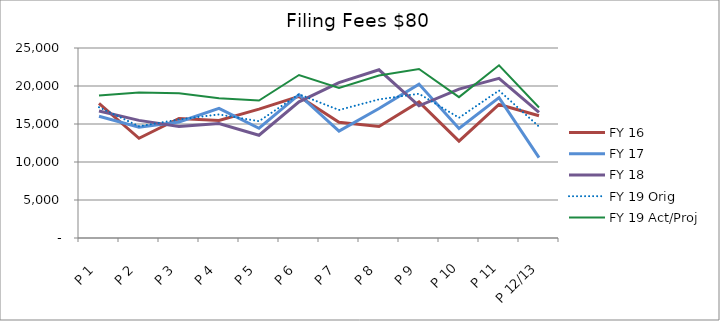
| Category | FY 16 | FY 17 | FY 18 | FY 19 Orig | FY 19 Act/Proj |
|---|---|---|---|---|---|
| P 1 | 17703.81 | 16021.78 | 16717.94 | 17211.376 | 18741.66 |
| P 2 | 13120.81 | 14580.92 | 15478.98 | 14698.019 | 19156 |
| P 3 | 15725.34 | 15259.1 | 14685.26 | 15597.619 | 19045.12 |
| P 4 | 15466.65 | 17060.52 | 15052.3 | 16259.147 | 18394.88 |
| P 5 | 16952.6 | 14438.94 | 13520 | 15366.67 | 18080 |
| P 6 | 18625.64 | 18853.32 | 17920 | 18917.612 | 21445.12 |
| P 7 | 15216.2 | 14067.71 | 20447 | 16842.163 | 19730.025 |
| P 8 | 14681.02 | 17040 | 22134.07 | 18241.593 | 21369.41 |
| P 9 | 17893 | 20250.26 | 17390.69 | 18983.415 | 22238.428 |
| P 10 | 12738.23 | 14415.52 | 19592.56 | 15821.365 | 18534.194 |
| P 11 | 17568.01 | 18477.16 | 21011.5 | 19402.681 | 22729.584 |
| P 12/13 | 16080 | 10570.11 | 16526.1 | 14658.34 | 17171.75 |